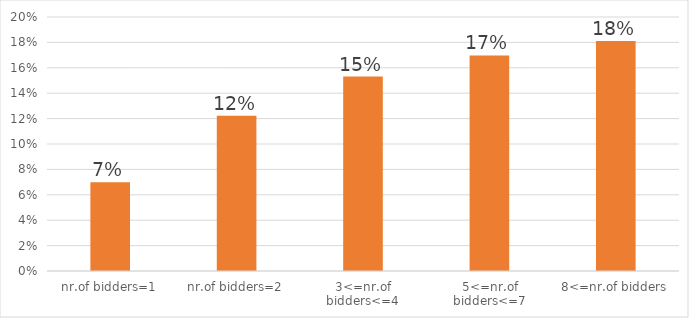
| Category | savings |
|---|---|
| nr.of bidders=1 | 0.07 |
| nr.of bidders=2 | 0.122 |
| 3<=nr.of bidders<=4 | 0.153 |
| 5<=nr.of bidders<=7 | 0.17 |
| 8<=nr.of bidders | 0.181 |